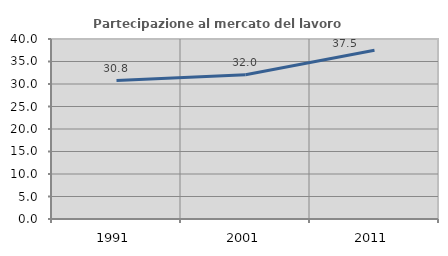
| Category | Partecipazione al mercato del lavoro  femminile |
|---|---|
| 1991.0 | 30.76 |
| 2001.0 | 32.035 |
| 2011.0 | 37.5 |